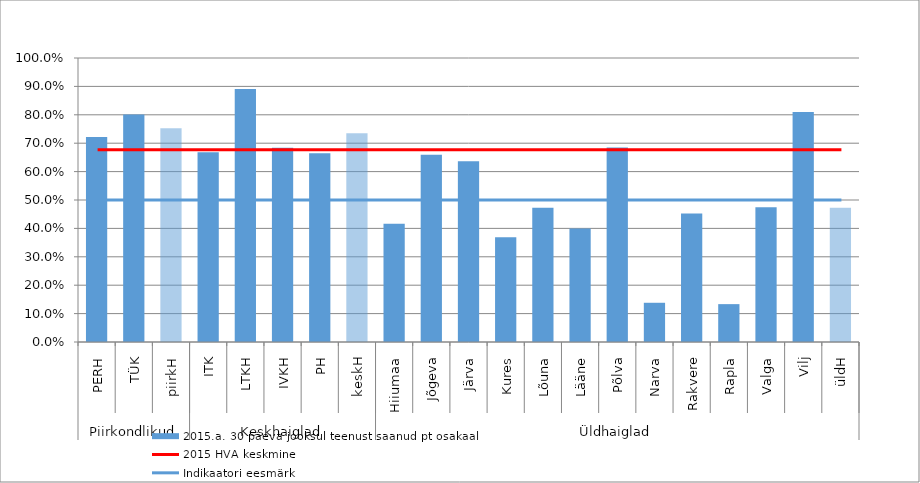
| Category | 2015.a. 30 päeva jooksul teenust saanud pt osakaal |
|---|---|
| 0 | 0.722 |
| 1 | 0.801 |
| 2 | 0.753 |
| 3 | 0.668 |
| 4 | 0.891 |
| 5 | 0.684 |
| 6 | 0.665 |
| 7 | 0.735 |
| 8 | 0.417 |
| 9 | 0.66 |
| 10 | 0.636 |
| 11 | 0.368 |
| 12 | 0.473 |
| 13 | 0.4 |
| 14 | 0.685 |
| 15 | 0.138 |
| 16 | 0.453 |
| 17 | 0.133 |
| 18 | 0.474 |
| 19 | 0.81 |
| 20 | 0.472 |